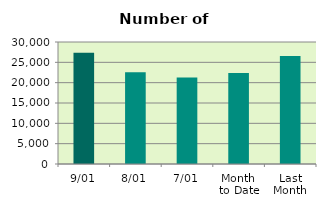
| Category | Series 0 |
|---|---|
| 9/01 | 27330 |
| 8/01 | 22590 |
| 7/01 | 21264 |
| Month 
to Date | 22396.667 |
| Last
Month | 26558.947 |